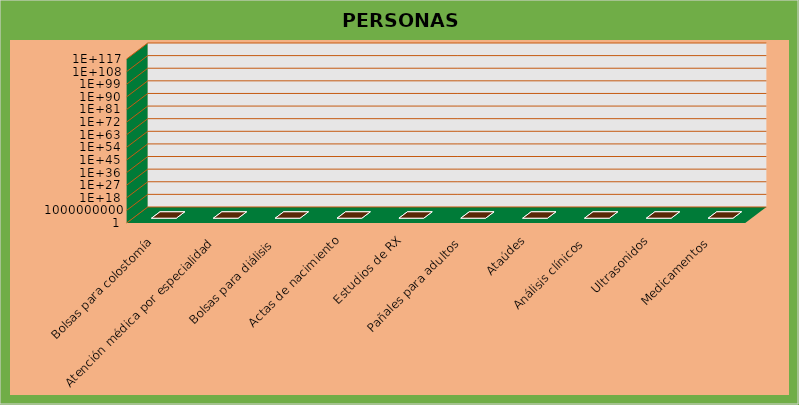
| Category | Series 0 |
|---|---|
| Bolsas para colostomía | 1 |
| Atención médica por especialidad  | 9 |
| Bolsas para diálisis  | 9 |
| Actas de nacimiento | 14 |
| Estudios de RX | 14 |
| Pañales para adultos  | 16 |
| Ataúdes | 14 |
| Análisis clínicos  | 19 |
| Ultrasonidos | 27 |
| Medicamentos  | 109 |